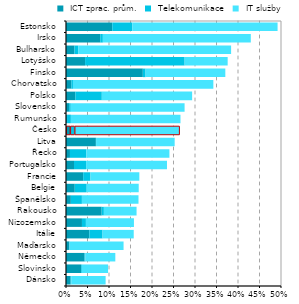
| Category |  ICT zprac. prům. |  Telekomunikace |  IT služby |
|---|---|---|---|
| Dánsko | 0.011 | 0.002 | 0.08 |
| Slovinsko | 0.035 | 0.002 | 0.061 |
| Německo | 0.043 | 0.002 | 0.069 |
| Maďarsko | 0.008 | 0.001 | 0.125 |
| Itálie | 0.054 | 0.031 | 0.073 |
| Nizozemsko | 0.037 | 0.009 | 0.112 |
| Rakousko | 0.083 | 0.005 | 0.076 |
| Španělsko | 0.011 | 0.026 | 0.132 |
| Belgie | 0.02 | 0.028 | 0.121 |
| Francie | 0.04 | 0.017 | 0.114 |
| Portugalsko | 0.019 | 0.028 | 0.188 |
| Řecko | 0.009 | 0.038 | 0.193 |
| Litva | 0.069 | 0 | 0.183 |
| Česko | 0.009 | 0.01 | 0.244 |
| Rumunsko | 0.002 | 0.009 | 0.255 |
| Slovensko | 0.007 | 0.004 | 0.265 |
| Polsko | 0.022 | 0.062 | 0.21 |
| Chorvatsko | 0.012 | 0.004 | 0.326 |
| Finsko | 0.179 | 0.006 | 0.185 |
| Lotyšsko | 0.044 | 0.231 | 0.1 |
| Bulharsko | 0.02 | 0.009 | 0.355 |
| Irsko | 0.08 | 0.006 | 0.344 |
| Estonsko | 0.108 | 0.046 | 0.338 |